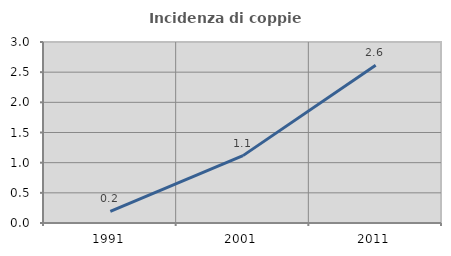
| Category | Incidenza di coppie miste |
|---|---|
| 1991.0 | 0.194 |
| 2001.0 | 1.117 |
| 2011.0 | 2.616 |